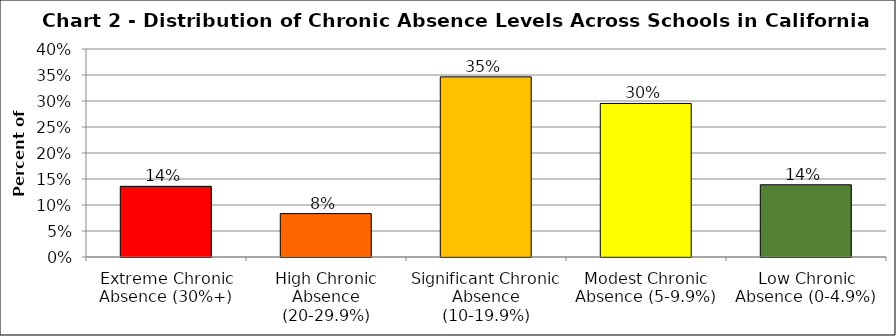
| Category | Series 1 |
|---|---|
| Extreme Chronic Absence (30%+) | 0.136 |
| High Chronic Absence (20-29.9%) | 0.084 |
| Significant Chronic Absence (10-19.9%) | 0.346 |
| Modest Chronic Absence (5-9.9%) | 0.295 |
| Low Chronic Absence (0-4.9%) | 0.139 |